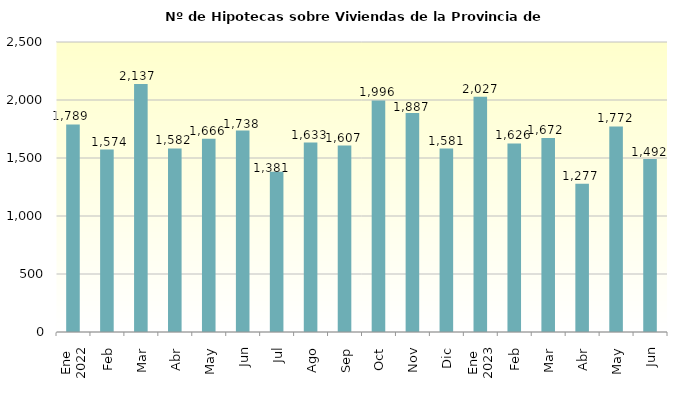
| Category | Series 0 |
|---|---|
| 0 | 1789 |
| 1 | 1574 |
| 2 | 2137 |
| 3 | 1582 |
| 4 | 1666 |
| 5 | 1738 |
| 6 | 1381 |
| 7 | 1633 |
| 8 | 1607 |
| 9 | 1996 |
| 10 | 1887 |
| 11 | 1581 |
| 12 | 2027 |
| 13 | 1626 |
| 14 | 1672 |
| 15 | 1277 |
| 16 | 1772 |
| 17 | 1492 |